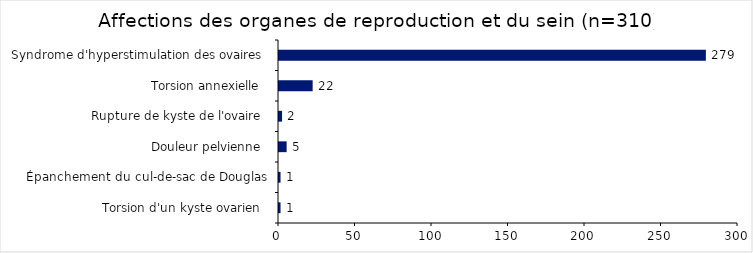
| Category | Series 0 |
|---|---|
|  Torsion d'un kyste ovarien  | 1 |
| Épanchement du cul-de-sac de Douglas | 1 |
| Douleur pelvienne  | 5 |
| Rupture de kyste de l'ovaire  | 2 |
| Torsion annexielle  | 22 |
| Syndrome d'hyperstimulation des ovaires  | 279 |